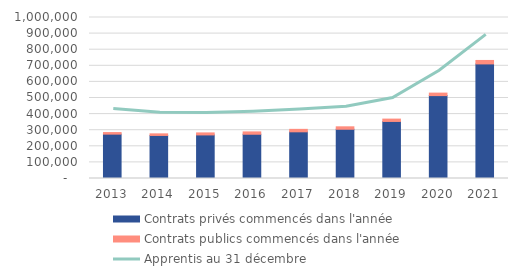
| Category | Contrats privés commencés dans l'année | Contrats publics commencés dans l'année |
|---|---|---|
| 2013.0 | 275527 | 9815 |
| 2014.0 | 267419 | 9874 |
| 2015.0 | 270624 | 12558 |
| 2016.0 | 274890 | 14588 |
| 2017.0 | 289938 | 15333 |
| 2018.0 | 305895 | 15143 |
| 2019.0 | 354368 | 14600 |
| 2020.0 | 514888 | 15511 |
| 2021.0 | 711673 | 21521 |